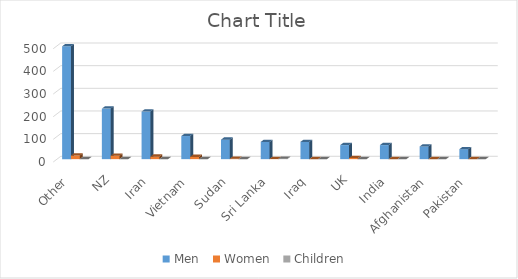
| Category | Men  | Women  | Children  |
|---|---|---|---|
| Other  | 498 | 16 | 0 |
| NZ | 223 | 15 | 0 |
| Iran  | 210 | 11 | 0 |
| Vietnam  | 102 | 10 | 0 |
| Sudan  | 86 | 2 | 0 |
| Sri Lanka  | 76 | 1 | 2 |
| Iraq  | 76 | 0 | 0 |
| UK | 62 | 5 | 0 |
| India  | 62 | 0 | 0 |
| Afghanistan  | 56 | 0 | 0 |
| Pakistan  | 44 | 0 | 0 |